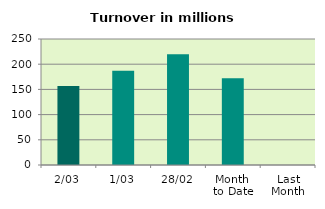
| Category | Series 0 |
|---|---|
| 2/03 | 156.834 |
| 1/03 | 187.1 |
| 28/02 | 219.511 |
| Month 
to Date | 171.967 |
| Last
Month | 0 |